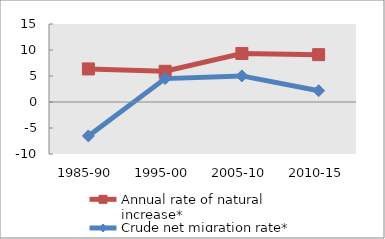
| Category | Annual rate of natural increase* | Crude net migration rate* |
|---|---|---|
| 1985-90 | 6.359 | -6.522 |
| 1995-00 | 5.903 | 4.5 |
| 2005-10 | 9.337 | 5.018 |
| 2010-15 | 9.105 | 2.175 |